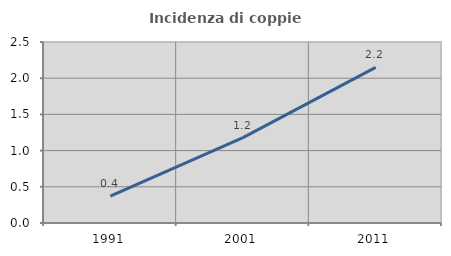
| Category | Incidenza di coppie miste |
|---|---|
| 1991.0 | 0.372 |
| 2001.0 | 1.179 |
| 2011.0 | 2.15 |